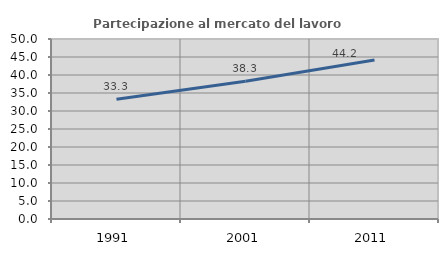
| Category | Partecipazione al mercato del lavoro  femminile |
|---|---|
| 1991.0 | 33.274 |
| 2001.0 | 38.268 |
| 2011.0 | 44.162 |